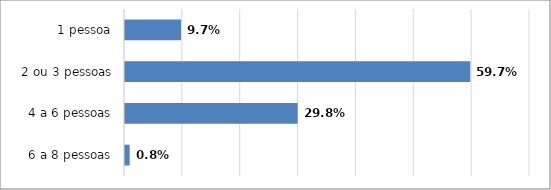
| Category | Series 0 |
|---|---|
| 6 a 8 pessoas | 0.008 |
| 4 a 6 pessoas | 0.298 |
| 2 ou 3 pessoas | 0.597 |
| 1 pessoa | 0.097 |